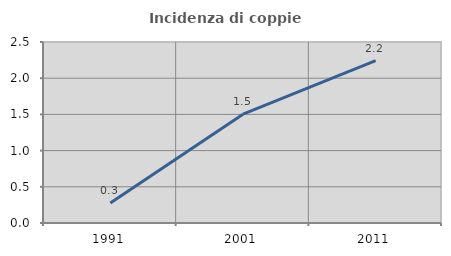
| Category | Incidenza di coppie miste |
|---|---|
| 1991.0 | 0.277 |
| 2001.0 | 1.503 |
| 2011.0 | 2.242 |